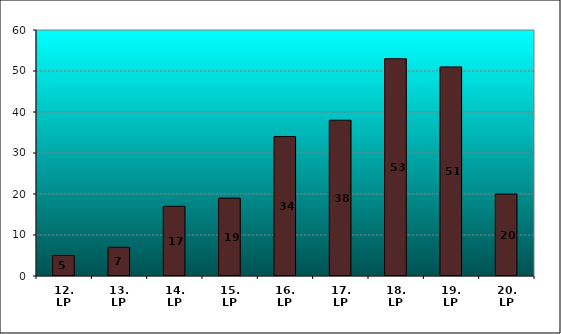
| Category | Series 0 |
|---|---|
| 12. LP | 5 |
| 13. LP | 7 |
| 14. LP | 17 |
| 15. LP | 19 |
| 16. LP | 34 |
| 17. LP | 38 |
| 18. LP | 53 |
| 19. LP | 51 |
| 20. LP | 20 |